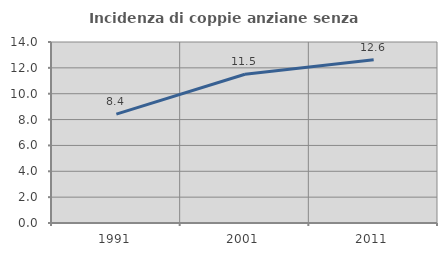
| Category | Incidenza di coppie anziane senza figli  |
|---|---|
| 1991.0 | 8.416 |
| 2001.0 | 11.508 |
| 2011.0 | 12.619 |